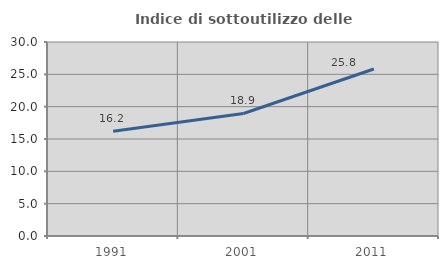
| Category | Indice di sottoutilizzo delle abitazioni  |
|---|---|
| 1991.0 | 16.186 |
| 2001.0 | 18.946 |
| 2011.0 | 25.821 |